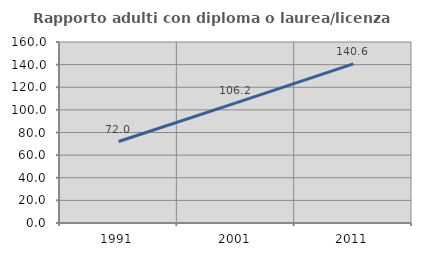
| Category | Rapporto adulti con diploma o laurea/licenza media  |
|---|---|
| 1991.0 | 72.021 |
| 2001.0 | 106.178 |
| 2011.0 | 140.625 |